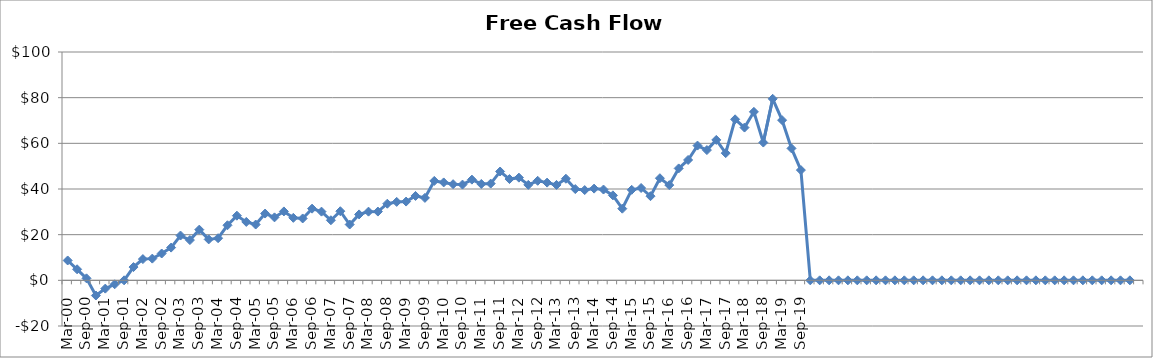
| Category | Series 0 |
|---|---|
| Mar-00 | 8.697 |
| Jun-00 | 4.835 |
| Sep-00 | 0.877 |
| Dec-00 | -6.644 |
| Mar-01 | -3.628 |
| Jun-01 | -1.724 |
| Sep-01 | 0 |
| Dec-01 | 5.808 |
| Mar-02 | 9.302 |
| Jun-02 | 9.508 |
| Sep-02 | 11.75 |
| Dec-02 | 14.338 |
| Mar-03 | 19.618 |
| Jun-03 | 17.633 |
| Sep-03 | 22.197 |
| Dec-03 | 17.93 |
| Mar-04 | 18.456 |
| Jun-04 | 24.124 |
| Sep-04 | 28.318 |
| Dec-04 | 25.574 |
| Mar-05 | 24.436 |
| Jun-05 | 29.244 |
| Sep-05 | 27.58 |
| Dec-05 | 30.178 |
| Mar-06 | 27.368 |
| Jun-06 | 27.099 |
| Sep-06 | 31.394 |
| Dec-06 | 30.085 |
| Mar-07 | 26.314 |
| Jun-07 | 30.263 |
| Sep-07 | 24.448 |
| Dec-07 | 28.873 |
| Mar-08 | 30.081 |
| Jun-08 | 30.114 |
| Sep-08 | 33.552 |
| Dec-08 | 34.349 |
| Mar-09 | 34.495 |
| Jun-09 | 36.958 |
| Sep-09 | 36.104 |
| Dec-09 | 43.538 |
| Mar-10 | 42.878 |
| Jun-10 | 42.109 |
| Sep-10 | 41.932 |
| Dec-10 | 44.101 |
| Mar-11 | 42.21 |
| Jun-11 | 42.372 |
| Sep-11 | 47.662 |
| Dec-11 | 44.356 |
| Mar-12 | 44.97 |
| Jun-12 | 41.801 |
| Sep-12 | 43.592 |
| Dec-12 | 42.798 |
| Mar-13 | 41.777 |
| Jun-13 | 44.497 |
| Sep-13 | 39.969 |
| Dec-13 | 39.537 |
| Mar-14 | 40.167 |
| Jun-14 | 39.762 |
| Sep-14 | 37.218 |
| Dec-14 | 31.382 |
| Mar-15 | 39.644 |
| Jun-15 | 40.443 |
| Sep-15 | 36.858 |
| Dec-15 | 44.727 |
| Mar-16 | 41.706 |
| Jun-16 | 49.014 |
| Sep-16 | 52.717 |
| Dec-16 | 59.018 |
| Mar-17 | 57.044 |
| Jun-17 | 61.497 |
| Sep-17 | 55.7 |
| Dec-17 | 70.52 |
| Mar-18 | 66.901 |
| Jun-18 | 73.789 |
| Sep-18 | 60.343 |
| Dec-18 | 79.503 |
| Mar-19 | 70.148 |
| Jun-19 | 57.781 |
| Sep-19 | 48.278 |